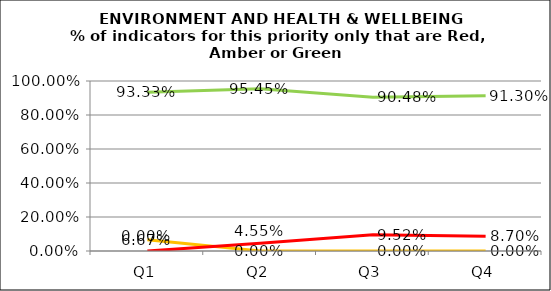
| Category | Green | Amber | Red |
|---|---|---|---|
| Q1 | 0.933 | 0.067 | 0 |
| Q2 | 0.955 | 0 | 0.045 |
| Q3 | 0.905 | 0 | 0.095 |
| Q4 | 0.913 | 0 | 0.087 |